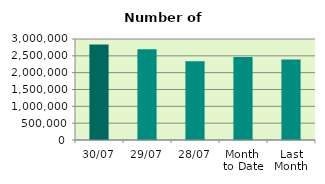
| Category | Series 0 |
|---|---|
| 30/07 | 2836030 |
| 29/07 | 2698160 |
| 28/07 | 2341530 |
| Month 
to Date | 2465054.636 |
| Last
Month | 2394428.455 |